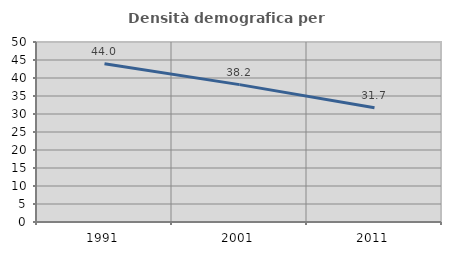
| Category | Densità demografica |
|---|---|
| 1991.0 | 43.956 |
| 2001.0 | 38.161 |
| 2011.0 | 31.722 |